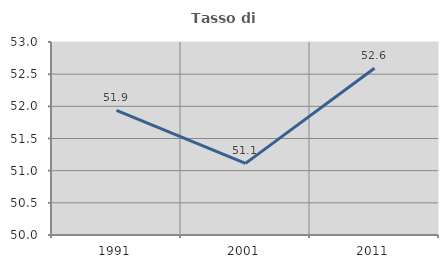
| Category | Tasso di occupazione   |
|---|---|
| 1991.0 | 51.939 |
| 2001.0 | 51.113 |
| 2011.0 | 52.591 |